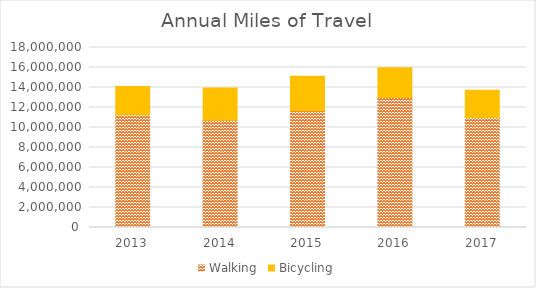
| Category | Walking | Bicycling |
|---|---|---|
| 2013 | 11285609 | 2803501.855 |
| 2014 | 10718508 | 3241322.133 |
| 2015 | 11677626 | 3450681.253 |
| 2016 | 13002401 | 2973108.405 |
| 2017 | 10993223 | 2736354.358 |